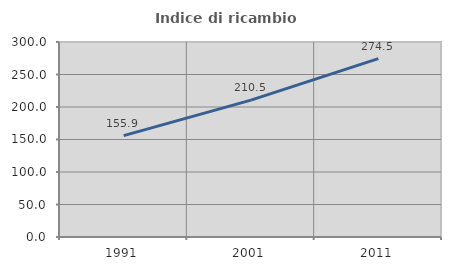
| Category | Indice di ricambio occupazionale  |
|---|---|
| 1991.0 | 155.909 |
| 2001.0 | 210.505 |
| 2011.0 | 274.477 |